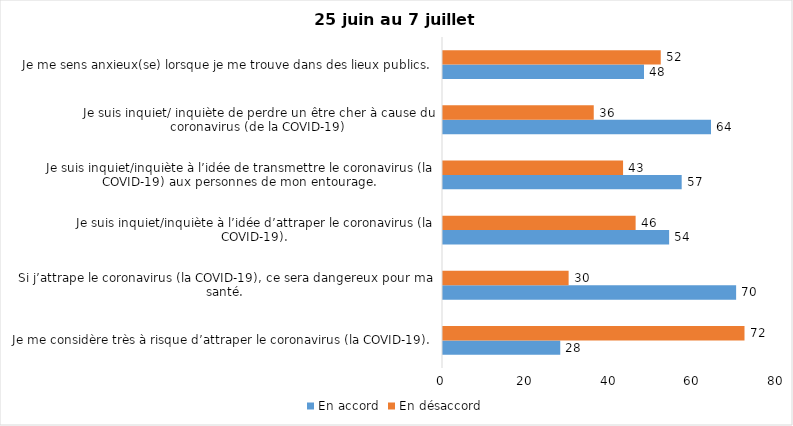
| Category | En accord | En désaccord |
|---|---|---|
| Je me considère très à risque d’attraper le coronavirus (la COVID-19). | 28 | 72 |
| Si j’attrape le coronavirus (la COVID-19), ce sera dangereux pour ma santé. | 70 | 30 |
| Je suis inquiet/inquiète à l’idée d’attraper le coronavirus (la COVID-19). | 54 | 46 |
| Je suis inquiet/inquiète à l’idée de transmettre le coronavirus (la COVID-19) aux personnes de mon entourage. | 57 | 43 |
| Je suis inquiet/ inquiète de perdre un être cher à cause du coronavirus (de la COVID-19) | 64 | 36 |
| Je me sens anxieux(se) lorsque je me trouve dans des lieux publics. | 48 | 52 |